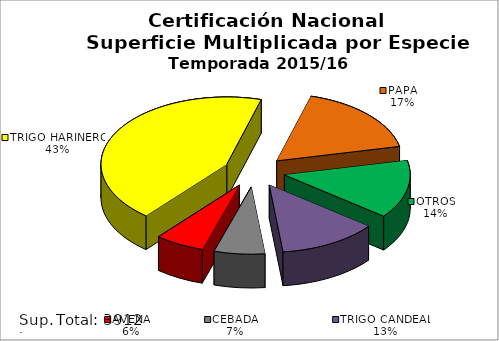
| Category | Series 0 |
|---|---|
| TRIGO HARINERO | 1694 |
| PAPA | 670 |
| OTROS | 547 |
| TRIGO CANDEAL | 498 |
| CEBADA | 255 |
| AVENA | 248 |